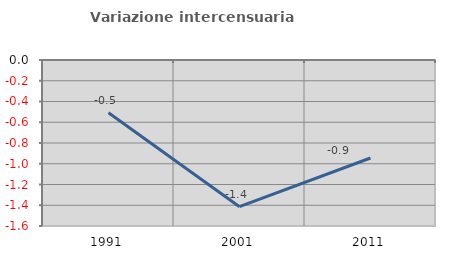
| Category | Variazione intercensuaria annua |
|---|---|
| 1991.0 | -0.508 |
| 2001.0 | -1.414 |
| 2011.0 | -0.944 |